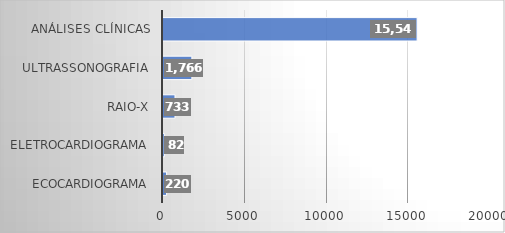
| Category | Series 0 |
|---|---|
| ECOCARDIOGRAMA | 220 |
| ELETROCARDIOGRAMA | 82 |
| RAIO-X | 733 |
| ULTRASSONOGRAFIA | 1766 |
| ANÁLISES CLÍNICAS | 15542 |